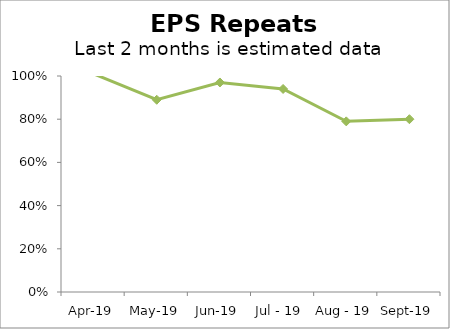
| Category | 27 BEAUMONT STREET |
|---|---|
| Apr-19 | 1.01 |
| May-19 | 0.89 |
| Jun-19 | 0.97 |
| Jul - 19  | 0.94 |
| Aug - 19 | 0.79 |
| Sept-19 | 0.8 |